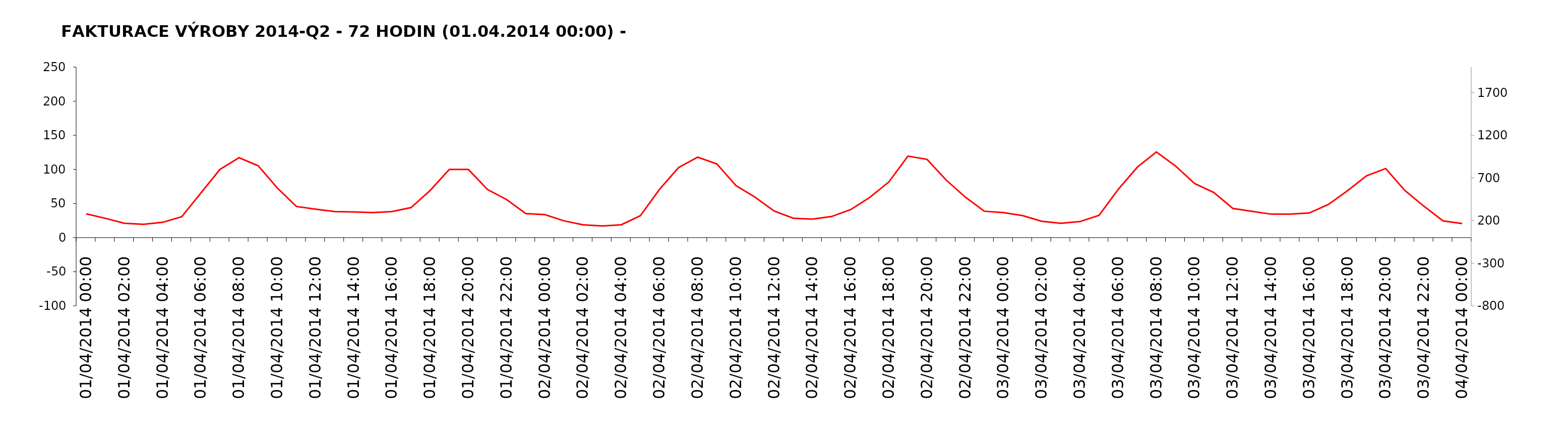
| Category | měření [MWh] |
|---|---|
| 01/04/2014 | 0 |
| 01/04/2014 | 0 |
| 01/04/2014 | 0 |
| 01/04/2014 | 0 |
| 01/04/2014 | 0 |
| 01/04/2014 | 0 |
| 01/04/2014 | 0 |
| 01/04/2014 | 0 |
| 01/04/2014 | 0 |
| 01/04/2014 | 0 |
| 01/04/2014 | 0 |
| 01/04/2014 | 0 |
| 01/04/2014 | 0 |
| 01/04/2014 | 0 |
| 01/04/2014 | 0 |
| 01/04/2014 | 0 |
| 01/04/2014 | 0 |
| 01/04/2014 | 0 |
| 01/04/2014 | 0 |
| 01/04/2014 | 0 |
| 01/04/2014 | 0 |
| 01/04/2014 | 0 |
| 01/04/2014 | 0 |
| 01/04/2014 | 0 |
| 02/04/2014 | 0 |
| 02/04/2014 | 0 |
| 02/04/2014 | 0 |
| 02/04/2014 | 0 |
| 02/04/2014 | 0 |
| 02/04/2014 | 0 |
| 02/04/2014 | 0 |
| 02/04/2014 | 0 |
| 02/04/2014 | 0 |
| 02/04/2014 | 0 |
| 02/04/2014 | 0 |
| 02/04/2014 | 0 |
| 02/04/2014 | 0 |
| 02/04/2014 | 0 |
| 02/04/2014 | 0 |
| 02/04/2014 | 0 |
| 02/04/2014 | 0 |
| 02/04/2014 | 0 |
| 02/04/2014 | 0 |
| 02/04/2014 | 0 |
| 02/04/2014 | 0 |
| 02/04/2014 | 0 |
| 02/04/2014 | 0 |
| 02/04/2014 | 0 |
| 03/04/2014 | 0 |
| 03/04/2014 | 0 |
| 03/04/2014 | 0 |
| 03/04/2014 | 0 |
| 03/04/2014 | 0 |
| 03/04/2014 | 0 |
| 03/04/2014 | 0 |
| 03/04/2014 | 0 |
| 03/04/2014 | 0 |
| 03/04/2014 | 0 |
| 03/04/2014 | 0 |
| 03/04/2014 | 0 |
| 03/04/2014 | 0 |
| 03/04/2014 | 0 |
| 03/04/2014 | 0 |
| 03/04/2014 | 0 |
| 03/04/2014 | 0 |
| 03/04/2014 | 0 |
| 03/04/2014 | 0 |
| 03/04/2014 | 0 |
| 03/04/2014 | 0 |
| 03/04/2014 | 0 |
| 03/04/2014 | 0 |
| 03/04/2014 | 0 |
| 04/04/2014 | 0 |